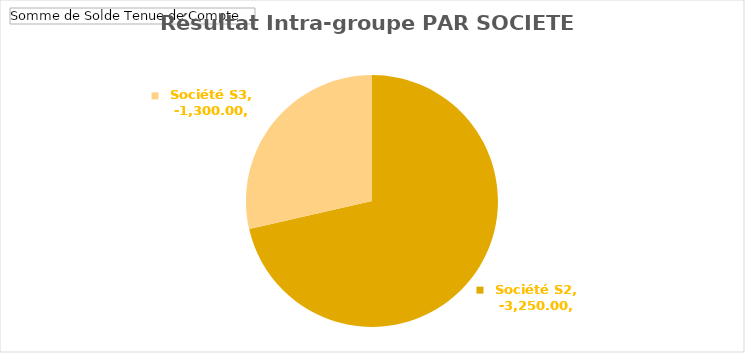
| Category | Total |
|---|---|
| Société S2 | -3250 |
| Société S3 | -1300 |